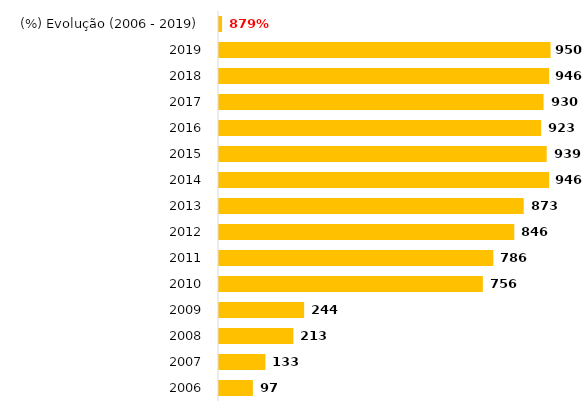
| Category | Téc. Adm. |
|---|---|
| 2006 | 97 |
| 2007 | 133 |
| 2008 | 213 |
| 2009 | 244 |
| 2010 | 756 |
| 2011 | 786 |
| 2012 | 846 |
| 2013 | 873 |
| 2014 | 946 |
| 2015 | 939 |
| 2016 | 923 |
| 2017 | 930 |
| 2018 | 946 |
| 2019 | 950 |
| (%) Evolução (2006 - 2019) | 8.794 |